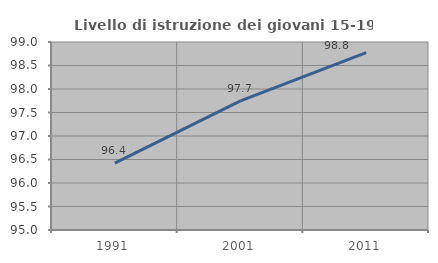
| Category | Livello di istruzione dei giovani 15-19 anni |
|---|---|
| 1991.0 | 96.422 |
| 2001.0 | 97.747 |
| 2011.0 | 98.776 |